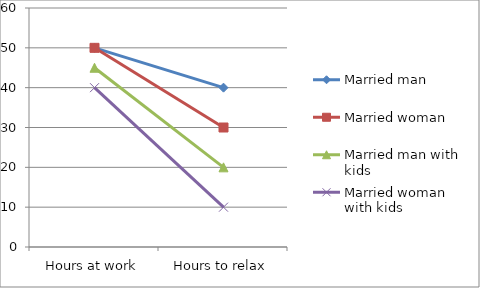
| Category | Married man | Married woman | Married man with kids | Married woman with kids |
|---|---|---|---|---|
| Hours at work | 50 | 50 | 45 | 40 |
| Hours to relax | 40 | 30 | 20 | 10 |